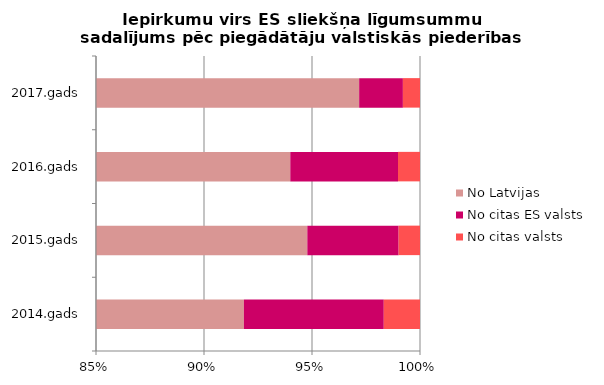
| Category | No Latvijas | No citas ES valsts | No citas valsts |
|---|---|---|---|
| 2014.gads | 872025609 | 61497046 | 15916028 |
| 2015.gads | 1068105565 | 47635817 | 11147509 |
| 2016.gads | 1097534032 | 58228848 | 11883675 |
| 2017.gads | 1648156744 | 34337984 | 13425989 |